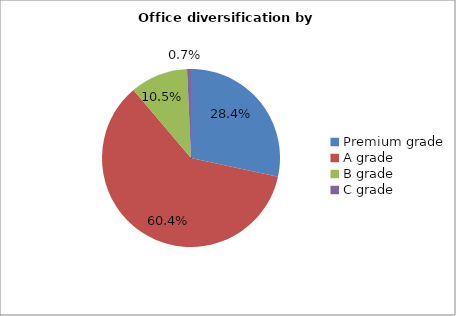
| Category | Series 0 |
|---|---|
| Premium grade | 0.284 |
| A grade | 0.604 |
| B grade | 0.105 |
| C grade | 0.007 |